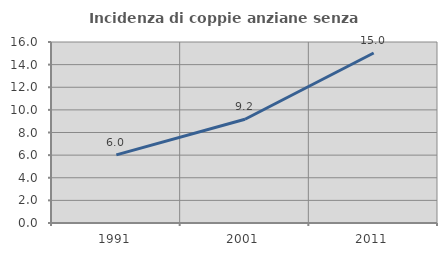
| Category | Incidenza di coppie anziane senza figli  |
|---|---|
| 1991.0 | 6.026 |
| 2001.0 | 9.168 |
| 2011.0 | 15.025 |